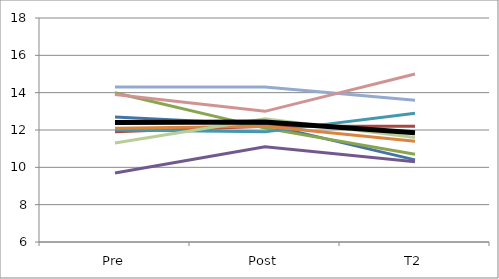
| Category | Series 0 | Series 1 | Series 2 | Series 3 | Series 4 | Series 5 | Series 6 | Series 7 | Series 8 | Mean |
|---|---|---|---|---|---|---|---|---|---|---|
| Pre | 12.7 | 11.9 | 14 | 9.7 | 12 | 12.1 | 14.3 | 13.9 | 11.3 | 12.4 |
| Post | 12.3 | 12.2 | 12.1 | 11.1 | 11.9 | 12.2 | 14.3 | 13 | 12.6 | 12.43 |
| T2 | 10.4 | 12.2 | 10.7 | 10.3 | 12.9 | 11.4 | 13.6 | 15 | 11.6 | 11.85 |